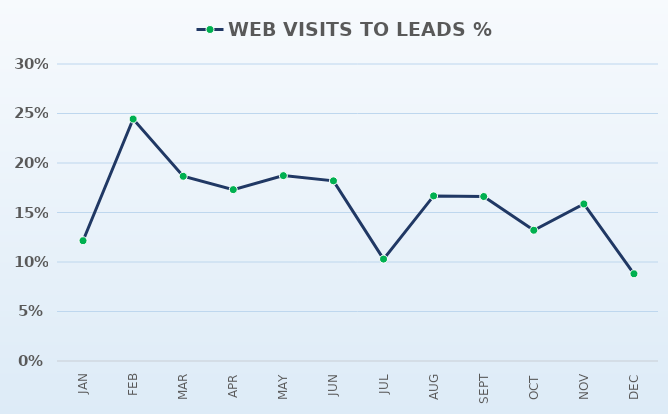
| Category | CONVERSION RATES | WEB VISITS TO LEADS % |
|---|---|---|
| JAN |  | 0.122 |
| FEB |  | 0.244 |
| MAR |  | 0.187 |
| APR |  | 0.173 |
| MAY |  | 0.187 |
| JUN |  | 0.182 |
| JUL |  | 0.103 |
| AUG |  | 0.167 |
| SEPT |  | 0.166 |
| OCT |  | 0.132 |
| NOV |  | 0.159 |
| DEC |  | 0.088 |